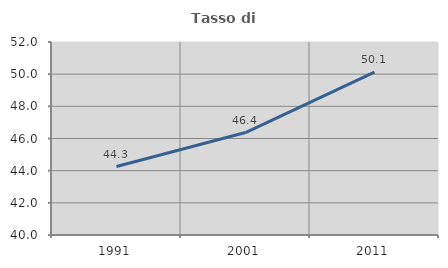
| Category | Tasso di occupazione   |
|---|---|
| 1991.0 | 44.256 |
| 2001.0 | 46.368 |
| 2011.0 | 50.131 |